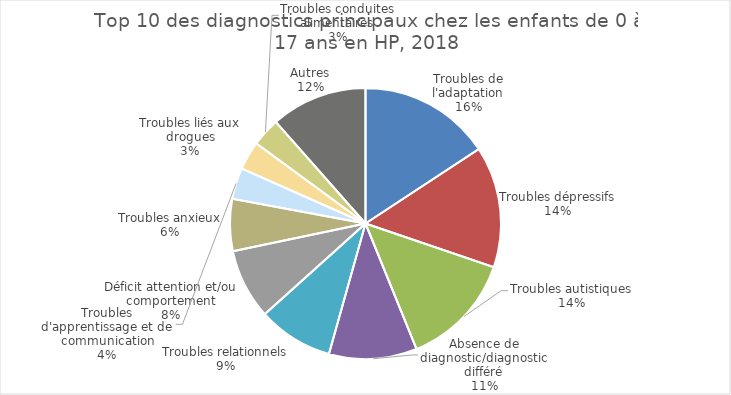
| Category | Fréquence |
|---|---|
| Troubles de l'adaptation | 447 |
| Troubles dépressifs | 411 |
| Troubles autistiques | 387 |
| Absence de diagnostic/diagnostic différé | 298 |
| Troubles relationnels | 255 |
| Déficit attention et/ou comportement | 238 |
| Troubles anxieux | 176 |
| Troubles d'apprentissage et de communication | 106 |
| Troubles liés aux drogues | 97 |
| Troubles conduites alimentaires | 97 |
| Autres | 327 |